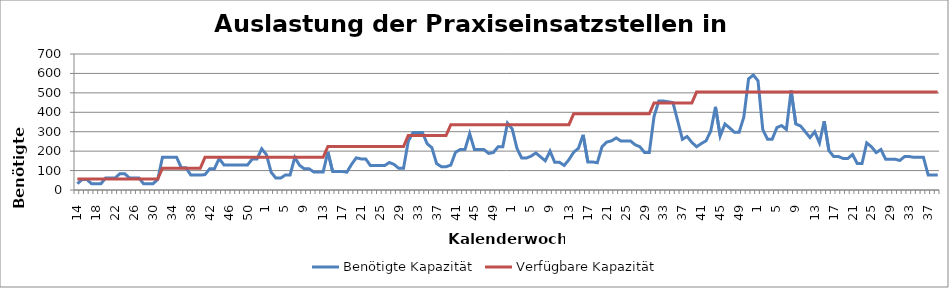
| Category | Benötigte Kapazität | Verfügbare Kapazität |
|---|---|---|
| 14.0 | 32.4 | 56 |
| 15.0 | 54 | 56 |
| 16.0 | 54 | 56 |
| 17.0 | 32.4 | 56 |
| 18.0 | 32.4 | 56 |
| 19.0 | 32.4 | 56 |
| 20.0 | 62.4 | 56 |
| 21.0 | 62.4 | 56 |
| 22.0 | 62.4 | 56 |
| 23.0 | 84 | 56 |
| 24.0 | 84 | 56 |
| 25.0 | 62.4 | 56 |
| 26.0 | 62.4 | 56 |
| 27.0 | 62.4 | 56 |
| 28.0 | 32.4 | 56 |
| 29.0 | 32.4 | 56 |
| 30.0 | 32.4 | 56 |
| 31.0 | 54 | 56 |
| 32.0 | 168 | 112 |
| 33.0 | 168 | 112 |
| 34.0 | 168 | 112 |
| 35.0 | 168 | 112 |
| 36.0 | 114 | 112 |
| 37.0 | 114 | 112 |
| 38.0 | 76.8 | 112 |
| 39.0 | 76.8 | 112 |
| 40.0 | 76.8 | 112 |
| 41.0 | 79.2 | 168 |
| 42.0 | 109.2 | 168 |
| 43.0 | 109.2 | 168 |
| 44.0 | 162 | 168 |
| 45.0 | 129.2 | 168 |
| 46.0 | 129.2 | 168 |
| 47.0 | 129.2 | 168 |
| 48.0 | 129.2 | 168 |
| 49.0 | 129.2 | 168 |
| 50.0 | 129.2 | 168 |
| 51.0 | 159.2 | 168 |
| 52.0 | 159.2 | 168 |
| 53.0 | 212 | 168 |
| 1.0 | 182 | 168 |
| 2.0 | 91.2 | 168 |
| 3.0 | 61.2 | 168 |
| 4.0 | 61.2 | 168 |
| 5.0 | 77.2 | 168 |
| 6.0 | 77.2 | 168 |
| 7.0 | 168 | 168 |
| 8.0 | 127.2 | 168 |
| 9.0 | 109.2 | 168 |
| 10.0 | 109.2 | 168 |
| 11.0 | 93.2 | 168 |
| 12.0 | 93.2 | 168 |
| 13.0 | 93.2 | 168 |
| 14.0 | 196 | 224 |
| 15.0 | 95.6 | 224 |
| 16.0 | 95.6 | 224 |
| 17.0 | 95.6 | 224 |
| 18.0 | 91.6 | 224 |
| 19.0 | 131.6 | 224 |
| 20.0 | 165.6 | 224 |
| 21.0 | 160 | 224 |
| 22.0 | 160 | 224 |
| 23.0 | 125.6 | 224 |
| 24.0 | 125.6 | 224 |
| 25.0 | 125.6 | 224 |
| 26.0 | 125.6 | 224 |
| 27.0 | 141.6 | 224 |
| 28.0 | 131.6 | 224 |
| 29.0 | 111.6 | 224 |
| 30.0 | 111.6 | 224 |
| 31.0 | 250 | 280 |
| 32.0 | 296 | 280 |
| 33.0 | 296 | 280 |
| 34.0 | 296 | 280 |
| 35.0 | 238 | 280 |
| 36.0 | 218 | 280 |
| 37.0 | 136 | 280 |
| 38.0 | 120 | 280 |
| 39.0 | 120 | 280 |
| 40.0 | 128 | 336 |
| 41.0 | 194 | 336 |
| 42.0 | 208.4 | 336 |
| 43.0 | 208.4 | 336 |
| 44.0 | 290 | 336 |
| 45.0 | 208.4 | 336 |
| 46.0 | 208.4 | 336 |
| 47.0 | 208.4 | 336 |
| 48.0 | 188.4 | 336 |
| 49.0 | 192.4 | 336 |
| 50.0 | 222.4 | 336 |
| 51.0 | 222.4 | 336 |
| 52.0 | 344 | 336 |
| 1.0 | 314 | 336 |
| 2.0 | 214.4 | 336 |
| 3.0 | 164.4 | 336 |
| 4.0 | 164.4 | 336 |
| 5.0 | 174.4 | 336 |
| 6.0 | 190.4 | 336 |
| 7.0 | 170.4 | 336 |
| 8.0 | 150.4 | 336 |
| 9.0 | 200 | 336 |
| 10.0 | 142.4 | 336 |
| 11.0 | 142.4 | 336 |
| 12.0 | 126.4 | 336 |
| 13.0 | 156.4 | 336 |
| 14.0 | 194.4 | 392 |
| 15.0 | 214.4 | 392 |
| 16.0 | 284 | 392 |
| 17.0 | 144.4 | 392 |
| 18.0 | 144.4 | 392 |
| 19.0 | 140.4 | 392 |
| 20.0 | 222.8 | 392 |
| 21.0 | 246.8 | 392 |
| 22.0 | 252.8 | 392 |
| 23.0 | 268 | 392 |
| 24.0 | 252 | 392 |
| 25.0 | 252.8 | 392 |
| 26.0 | 252.8 | 392 |
| 27.0 | 232.8 | 392 |
| 28.0 | 222.8 | 392 |
| 29.0 | 192.8 | 392 |
| 30.0 | 192.8 | 392 |
| 31.0 | 378 | 448 |
| 32.0 | 458 | 448 |
| 33.0 | 458 | 448 |
| 34.0 | 454 | 448 |
| 35.0 | 450 | 448 |
| 36.0 | 356 | 448 |
| 37.0 | 260.8 | 448 |
| 38.0 | 275.2 | 448 |
| 39.0 | 245.2 | 448 |
| 40.0 | 222.8 | 504 |
| 41.0 | 238.8 | 504 |
| 42.0 | 253.2 | 504 |
| 43.0 | 303.2 | 504 |
| 44.0 | 428 | 504 |
| 45.0 | 277.2 | 504 |
| 46.0 | 339.6 | 504 |
| 47.0 | 319.6 | 504 |
| 48.0 | 297.2 | 504 |
| 49.0 | 297.2 | 504 |
| 50.0 | 375.6 | 504 |
| 51.0 | 572 | 504 |
| 52.0 | 592 | 504 |
| 1.0 | 562 | 504 |
| 2.0 | 311.6 | 504 |
| 3.0 | 261.6 | 504 |
| 4.0 | 261.6 | 504 |
| 5.0 | 321.6 | 504 |
| 6.0 | 331.6 | 504 |
| 7.0 | 311.6 | 504 |
| 8.0 | 512 | 504 |
| 9.0 | 339.6 | 504 |
| 10.0 | 329.6 | 504 |
| 11.0 | 299.6 | 504 |
| 12.0 | 269.6 | 504 |
| 13.0 | 299.6 | 504 |
| 14.0 | 242.4 | 504 |
| 15.0 | 354 | 504 |
| 16.0 | 202.4 | 504 |
| 17.0 | 172.4 | 504 |
| 18.0 | 172.4 | 504 |
| 19.0 | 162.4 | 504 |
| 20.0 | 162.4 | 504 |
| 21.0 | 182.4 | 504 |
| 22.0 | 136 | 504 |
| 23.0 | 136 | 504 |
| 24.0 | 242.4 | 504 |
| 25.0 | 222.4 | 504 |
| 26.0 | 192.4 | 504 |
| 27.0 | 208.4 | 504 |
| 28.0 | 158.4 | 504 |
| 29.0 | 158.4 | 504 |
| 30.0 | 158.4 | 504 |
| 31.0 | 152 | 504 |
| 32.0 | 172 | 504 |
| 33.0 | 172 | 504 |
| 34.0 | 168 | 504 |
| 35.0 | 168 | 504 |
| 36.0 | 168 | 504 |
| 37.0 | 77.2 | 504 |
| 38.0 | 77.2 | 504 |
| 39.0 | 77.2 | 504 |